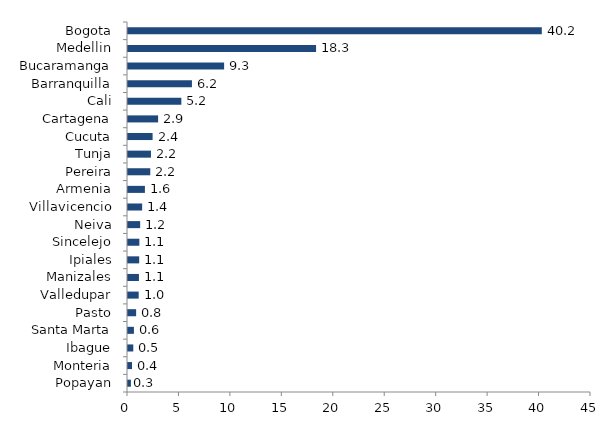
| Category | Series 0 |
|---|---|
| Popayan | 0.281 |
| Monteria | 0.386 |
| Ibague | 0.514 |
| Santa Marta | 0.576 |
| Pasto | 0.79 |
| Valledupar | 1.039 |
| Manizales | 1.064 |
| Ipiales | 1.088 |
| Sincelejo | 1.104 |
| Neiva | 1.183 |
| Villavicencio | 1.376 |
| Armenia | 1.643 |
| Pereira | 2.166 |
| Tunja | 2.232 |
| Cucuta | 2.391 |
| Cartagena | 2.926 |
| Cali | 5.185 |
| Barranquilla | 6.215 |
| Bucaramanga | 9.341 |
| Medellin | 18.279 |
| Bogota | 40.219 |